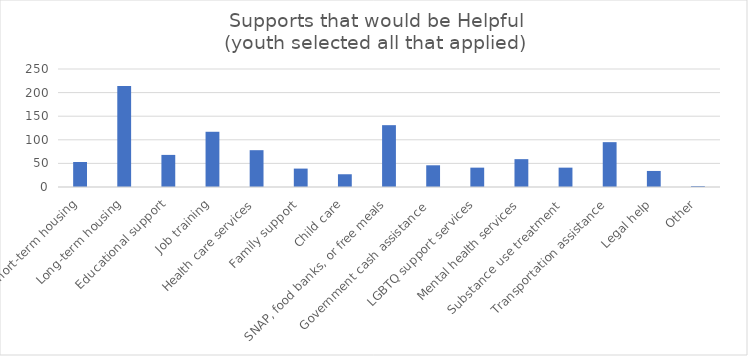
| Category | Series 0 |
|---|---|
| Short-term housing | 53 |
| Long-term housing | 214 |
| Educational support | 68 |
| Job training | 117 |
| Health care services | 78 |
| Family support | 39 |
| Child care | 27 |
| SNAP, food banks, or free meals | 131 |
| Government cash assistance  | 46 |
| LGBTQ support services | 41 |
| Mental health services | 59 |
| Substance use treatment  | 41 |
| Transportation assistance | 95 |
| Legal help | 34 |
| Other | 2 |